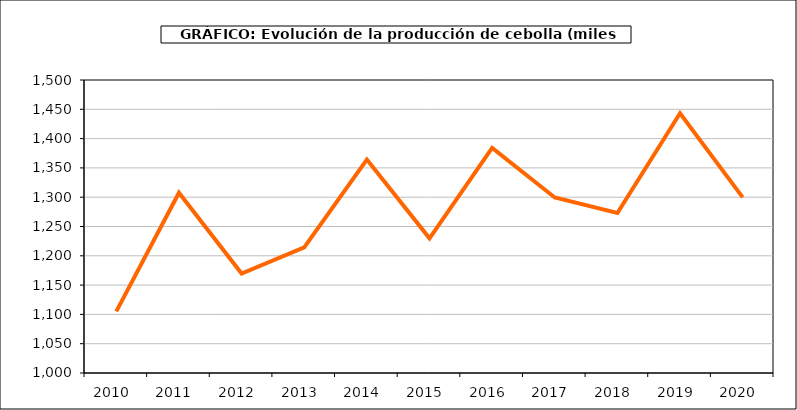
| Category | producción |
|---|---|
| 2010.0 | 1105.131 |
| 2011.0 | 1307.531 |
| 2012.0 | 1169.721 |
| 2013.0 | 1214.501 |
| 2014.0 | 1364.117 |
| 2015.0 | 1229.842 |
| 2016.0 | 1384.098 |
| 2017.0 | 1299.534 |
| 2018.0 | 1272.928 |
| 2019.0 | 1443.187 |
| 2020.0 | 1299.723 |